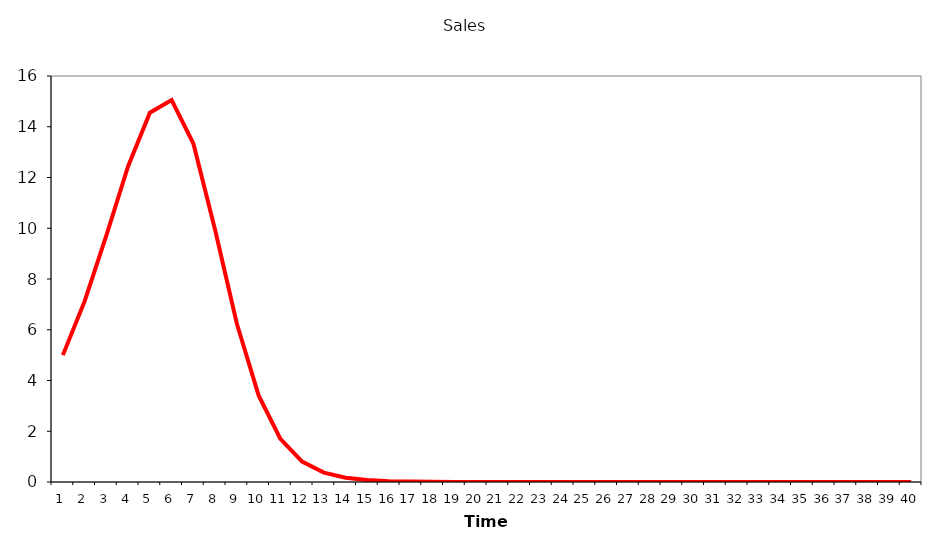
| Category | Sales |
|---|---|
| 0 | 5 |
| 1 | 7.125 |
| 2 | 9.721 |
| 3 | 12.445 |
| 4 | 14.552 |
| 5 | 15.051 |
| 6 | 13.34 |
| 7 | 9.93 |
| 8 | 6.236 |
| 9 | 3.412 |
| 10 | 1.703 |
| 11 | 0.806 |
| 12 | 0.371 |
| 13 | 0.169 |
| 14 | 0.076 |
| 15 | 0.034 |
| 16 | 0.016 |
| 17 | 0.007 |
| 18 | 0.003 |
| 19 | 0.001 |
| 20 | 0.001 |
| 21 | 0 |
| 22 | 0 |
| 23 | 0 |
| 24 | 0 |
| 25 | 0 |
| 26 | 0 |
| 27 | 0 |
| 28 | 0 |
| 29 | 0 |
| 30 | 0 |
| 31 | 0 |
| 32 | 0 |
| 33 | 0 |
| 34 | 0 |
| 35 | 0 |
| 36 | 0 |
| 37 | 0 |
| 38 | 0 |
| 39 | 0 |